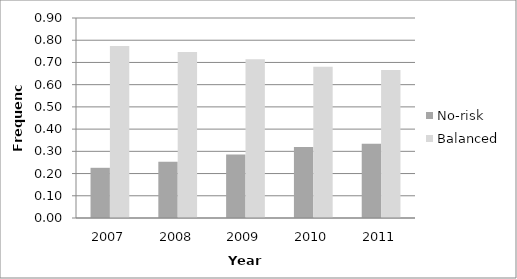
| Category | No-risk | Balanced |
|---|---|---|
| 2007.0 | 0.226 | 0.774 |
| 2008.0 | 0.253 | 0.747 |
| 2009.0 | 0.286 | 0.714 |
| 2010.0 | 0.32 | 0.68 |
| 2011.0 | 0.334 | 0.666 |